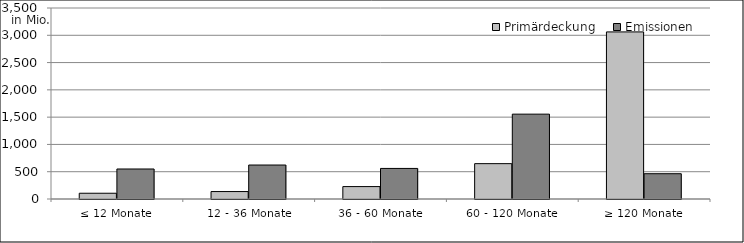
| Category | Primärdeckung | Emissionen |
|---|---|---|
| ≤ 12 Monate | 105447760.77 | 550000000 |
| 12 - 36 Monate | 136382332.616 | 622469336.9 |
| 36 - 60 Monate | 227529495.06 | 560150000 |
| 60 - 120 Monate | 647681000.502 | 1555000000 |
| ≥ 120 Monate | 3061785755.838 | 463289376.03 |